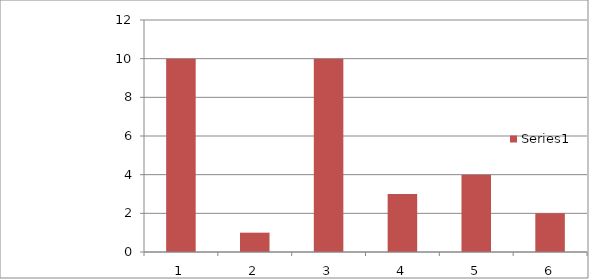
| Category | Series 1 |
|---|---|
| 0 | 10 |
| 1 | 1 |
| 2 | 10 |
| 3 | 3 |
| 4 | 4 |
| 5 | 2 |